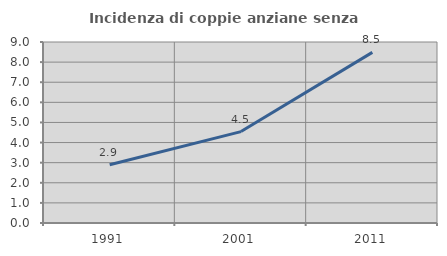
| Category | Incidenza di coppie anziane senza figli  |
|---|---|
| 1991.0 | 2.899 |
| 2001.0 | 4.545 |
| 2011.0 | 8.485 |